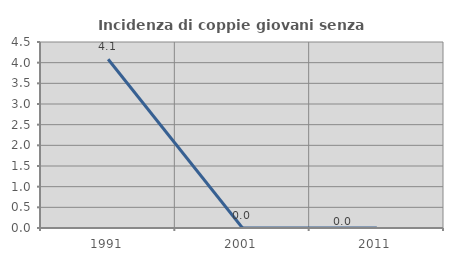
| Category | Incidenza di coppie giovani senza figli |
|---|---|
| 1991.0 | 4.082 |
| 2001.0 | 0 |
| 2011.0 | 0 |